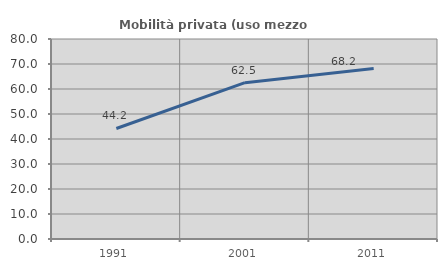
| Category | Mobilità privata (uso mezzo privato) |
|---|---|
| 1991.0 | 44.209 |
| 2001.0 | 62.534 |
| 2011.0 | 68.201 |